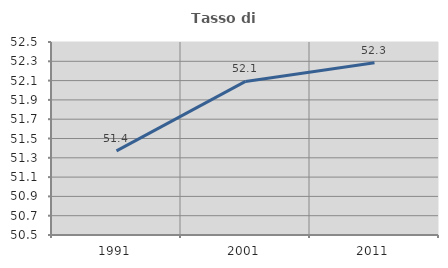
| Category | Tasso di occupazione   |
|---|---|
| 1991.0 | 51.372 |
| 2001.0 | 52.092 |
| 2011.0 | 52.284 |